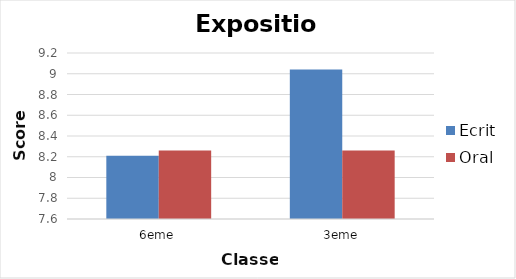
| Category | Ecrit | Oral |
|---|---|---|
| 6eme | 8.21 | 8.26 |
| 3eme | 9.04 | 8.26 |